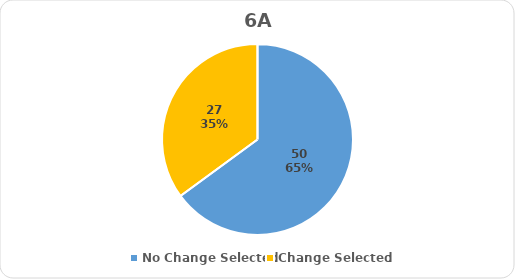
| Category | Series 0 |
|---|---|
| No Change Selected | 50 |
| Change Selected | 27 |